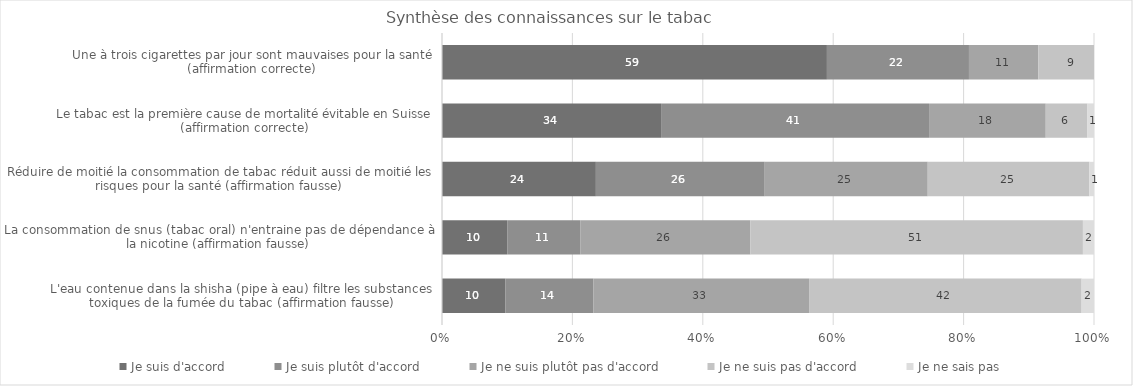
| Category | Je suis d'accord | Je suis plutôt d'accord | Je ne suis plutôt pas d'accord | Je ne suis pas d'accord | Je ne sais pas |
|---|---|---|---|---|---|
| Une à trois cigarettes par jour sont mauvaises pour la santé (affirmation correcte) | 58.8 | 21.7 | 10.6 | 8.5 | 0 |
| Le tabac est la première cause de mortalité évitable en Suisse (affirmation correcte) | 33.6 | 41.1 | 17.9 | 6.4 | 1 |
| Réduire de moitié la consommation de tabac réduit aussi de moitié les risques pour la santé (affirmation fausse) | 23.6 | 25.9 | 25 | 24.8 | 0.7 |
| La consommation de snus (tabac oral) n'entraine pas de dépendance à la nicotine (affirmation fausse) | 10 | 11.2 | 26.1 | 51 | 1.7 |
| L'eau contenue dans la shisha (pipe à eau) filtre les substances toxiques de la fumée du tabac (affirmation fausse) | 9.7 | 13.5 | 33.1 | 41.8 | 1.9 |